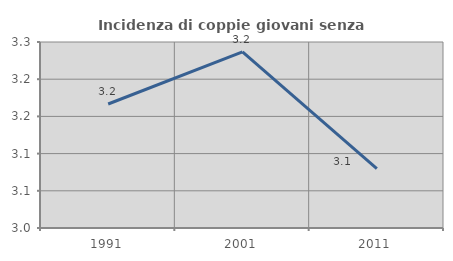
| Category | Incidenza di coppie giovani senza figli |
|---|---|
| 1991.0 | 3.167 |
| 2001.0 | 3.237 |
| 2011.0 | 3.08 |